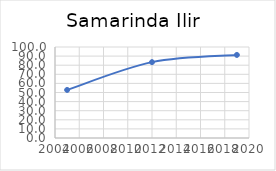
| Category | Series 0 |
|---|---|
| 2005.0 | 52.817 |
| 2012.0 | 83.364 |
| 2019.0 | 91.281 |